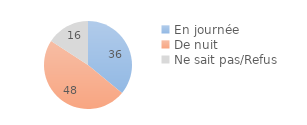
| Category | Series 0 |
|---|---|
| En journée | 35.955 |
| De nuit | 48.215 |
| Ne sait pas/Refus | 15.831 |